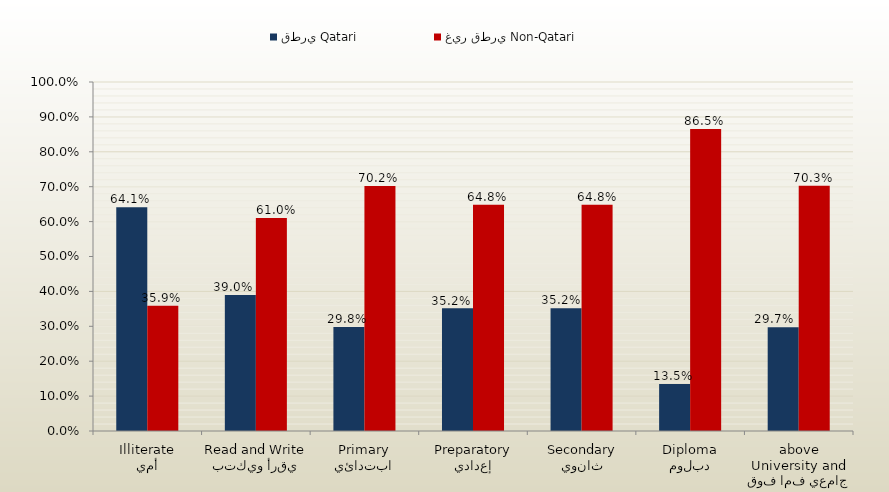
| Category | قطري Qatari | غير قطري Non-Qatari |
|---|---|---|
| أمي
Illiterate | 0.641 | 0.359 |
| يقرأ ويكتب
Read and Write | 0.39 | 0.61 |
| ابتدائي
Primary | 0.298 | 0.702 |
| إعدادي
Preparatory | 0.352 | 0.648 |
| ثانوي
Secondary | 0.352 | 0.648 |
| دبلوم
Diploma | 0.135 | 0.865 |
| جامعي فما فوق
University and above | 0.297 | 0.703 |